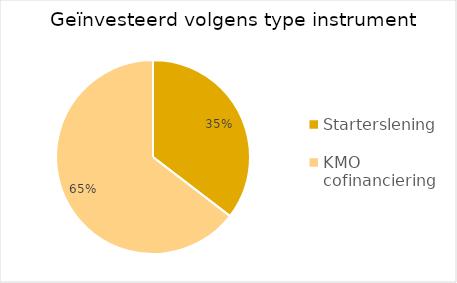
| Category | Series 0 |
|---|---|
| Starterslening | 19.363 |
| KMO cofinanciering | 35.32 |